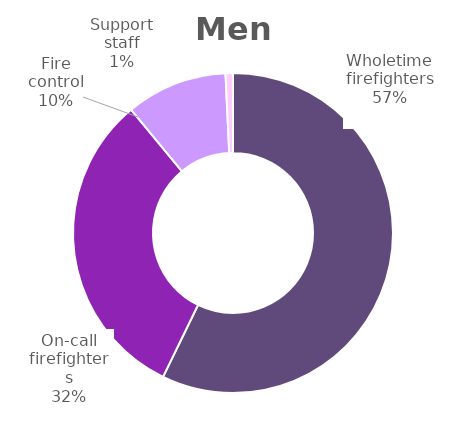
| Category | Men |
|---|---|
| Wholetime firefighters | 0.572 |
| On-call firefighters | 0.318 |
| Fire control | 0.103 |
| Support staff | 0.007 |